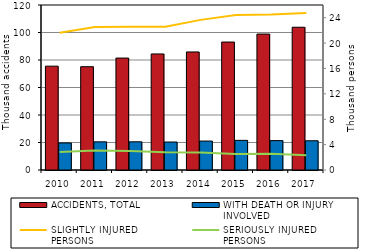
| Category | ACCIDENTS, TOTAL | WITH DEATH OR INJURY 
INVOLVED |
|---|---|---|
| 2010.0 | 75522 | 19676 |
| 2011.0 | 75137 | 20487 |
| 2012.0 | 81404 | 20504 |
| 2013.0 | 84398 | 20342 |
| 2014.0 | 85859 | 21054 |
| 2015.0 | 93067 | 21561 |
| 2016.0 | 98864 | 21386 |
| 2017.0 | 103821 | 21263 |